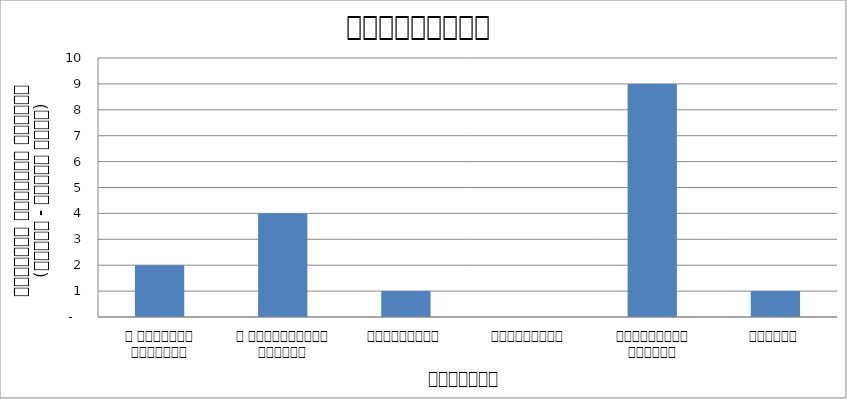
| Category | स्वास्थ्य  |
|---|---|
| द हिमालयन टाइम्स् | 2 |
| द काठमाण्डौं पोस्ट् | 4 |
| रिपब्लिका | 1 |
| कान्तिपुर | 0 |
| अन्नपूर्ण पोस्ट् | 9 |
| नागरिक | 1 |